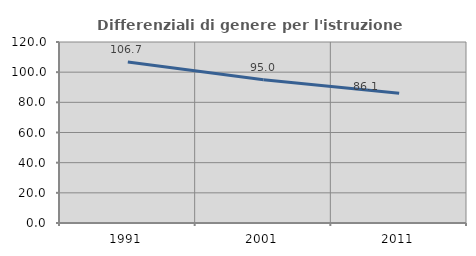
| Category | Differenziali di genere per l'istruzione superiore |
|---|---|
| 1991.0 | 106.692 |
| 2001.0 | 94.99 |
| 2011.0 | 86.069 |